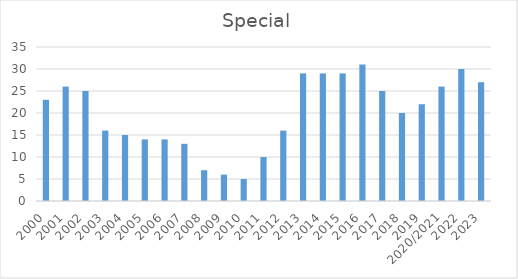
| Category | Special |
|---|---|
| 2000 | 23 |
| 2001 | 26 |
| 2002 | 25 |
| 2003 | 16 |
| 2004 | 15 |
| 2005 | 14 |
| 2006 | 14 |
| 2007 | 13 |
| 2008 | 7 |
| 2009 | 6 |
| 2010 | 5 |
| 2011 | 10 |
| 2012 | 16 |
| 2013 | 29 |
| 2014 | 29 |
| 2015 | 29 |
| 2016 | 31 |
| 2017 | 25 |
| 2018 | 20 |
| 2019 | 22 |
| 2020/2021 | 26 |
| 2022 | 30 |
| 2023 | 27 |